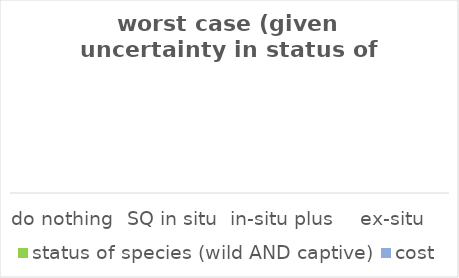
| Category | status of species (wild AND captive) | cost |
|---|---|---|
| do nothing | 0 | 0 |
| SQ in situ | 0 | 0 |
| in-situ plus | 0 | 0 |
| ex-situ | 0 | 0 |